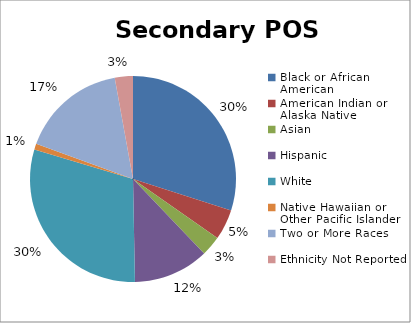
| Category | Series 0 |
|---|---|
| Black or African American | 0.299 |
| American Indian or Alaska Native | 0.048 |
| Asian | 0.031 |
| Hispanic | 0.118 |
| White | 0.299 |
| Native Hawaiian or Other Pacific Islander | 0.009 |
| Two or More Races | 0.166 |
| Ethnicity Not Reported | 0.028 |